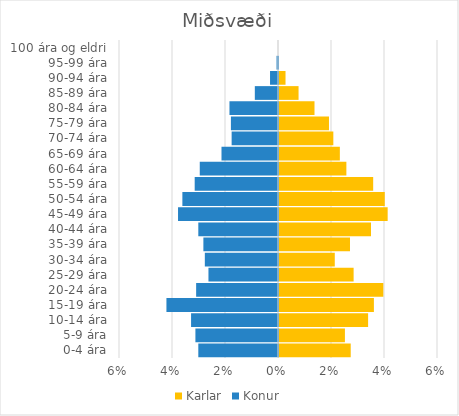
| Category | Karlar | Konur |
|---|---|---|
| 0-4 ára | 0.027 | -0.03 |
| 5-9 ára | 0.025 | -0.031 |
| 10-14 ára | 0.034 | -0.033 |
| 15-19 ára | 0.036 | -0.042 |
| 20-24 ára | 0.039 | -0.031 |
| 25-29 ára | 0.028 | -0.026 |
| 30-34 ára | 0.021 | -0.028 |
| 35-39 ára | 0.027 | -0.028 |
| 40-44 ára | 0.035 | -0.03 |
| 45-49 ára | 0.041 | -0.038 |
| 50-54 ára | 0.04 | -0.036 |
| 55-59 ára | 0.036 | -0.031 |
| 60-64 ára | 0.025 | -0.03 |
| 65-69 ára | 0.023 | -0.021 |
| 70-74 ára | 0.021 | -0.017 |
| 75-79 ára | 0.019 | -0.018 |
| 80-84 ára | 0.013 | -0.018 |
| 85-89 ára | 0.007 | -0.009 |
| 90-94 ára | 0.002 | -0.003 |
| 95-99 ára | 0 | -0.001 |
| 100 ára og eldri | 0 | 0 |